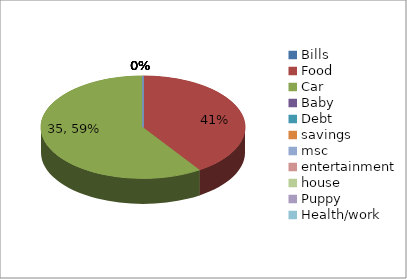
| Category | Series 0 |
|---|---|
| Bills | 0 |
| Food | 23.99 |
| Car | 35 |
| Baby  | 0 |
| Debt | 0 |
| savings | 0 |
| msc | 0 |
| entertainment | 0 |
| house | 0 |
| Puppy | 0 |
| Health/work | 0 |